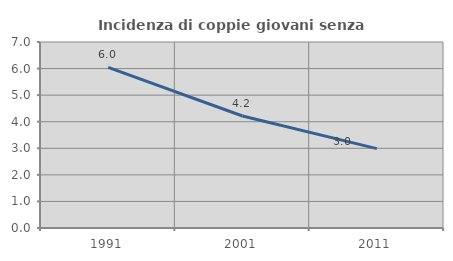
| Category | Incidenza di coppie giovani senza figli |
|---|---|
| 1991.0 | 6.044 |
| 2001.0 | 4.214 |
| 2011.0 | 2.987 |